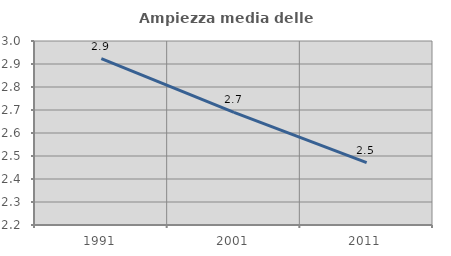
| Category | Ampiezza media delle famiglie |
|---|---|
| 1991.0 | 2.924 |
| 2001.0 | 2.689 |
| 2011.0 | 2.471 |